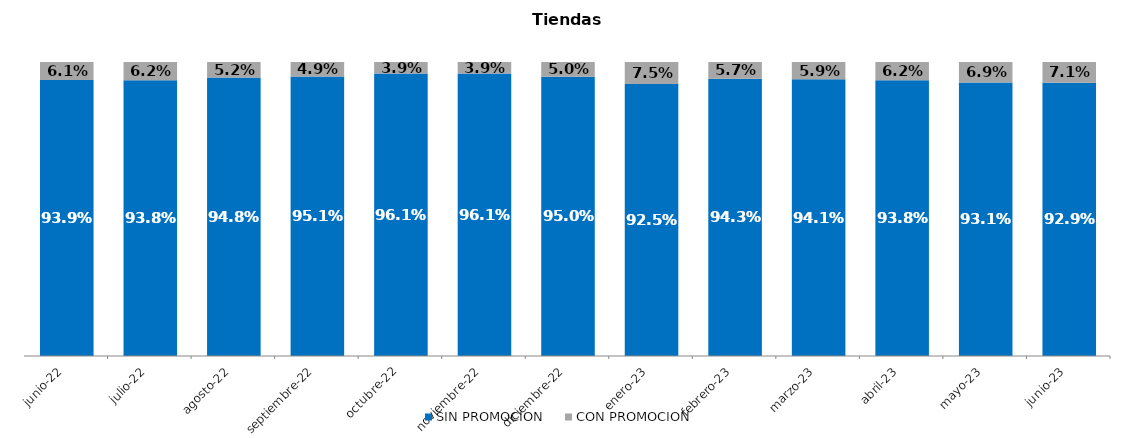
| Category | SIN PROMOCION   | CON PROMOCION   |
|---|---|---|
| 2022-06-01 | 0.939 | 0.061 |
| 2022-07-01 | 0.938 | 0.062 |
| 2022-08-01 | 0.948 | 0.052 |
| 2022-09-01 | 0.951 | 0.049 |
| 2022-10-01 | 0.961 | 0.039 |
| 2022-11-01 | 0.961 | 0.039 |
| 2022-12-01 | 0.95 | 0.05 |
| 2023-01-01 | 0.925 | 0.075 |
| 2023-02-01 | 0.943 | 0.057 |
| 2023-03-01 | 0.941 | 0.059 |
| 2023-04-01 | 0.938 | 0.062 |
| 2023-05-01 | 0.931 | 0.069 |
| 2023-06-01 | 0.929 | 0.071 |